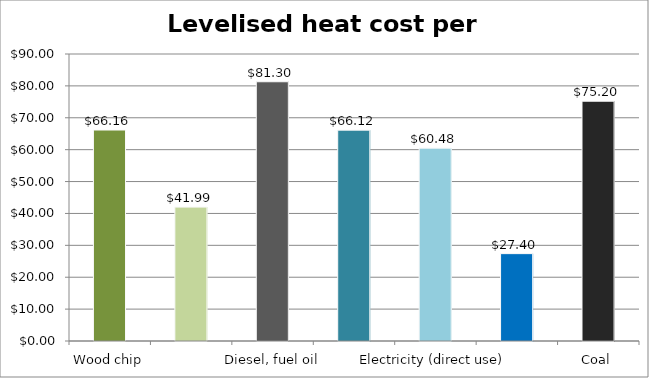
| Category | Series 0 |
|---|---|
| Wood chip | 66.158 |
| Wood pellets | 41.99 |
| Diesel, fuel oil | 81.295 |
| Natural gas or LPG | 66.123 |
| Electricity (direct use) | 60.479 |
| Electricity (heat pump) | 27.397 |
| Coal | 75.197 |